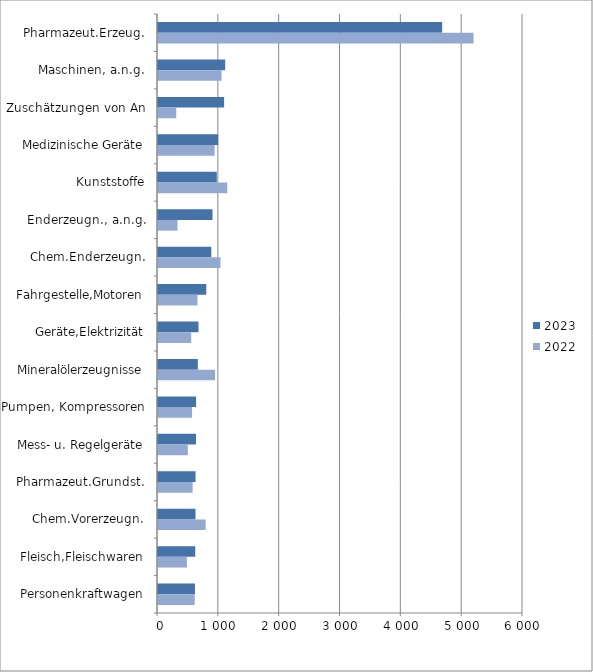
| Category | 2023 | 2022 |
|---|---|---|
| Pharmazeut.Erzeug. | 4671.345 | 5187.954 |
| Maschinen, a.n.g. | 1104.822 | 1044.624 |
| Zuschätzungen von An | 1086.782 | 299.87 |
| Medizinische Geräte | 989.804 | 931.34 |
| Kunststoffe | 966.875 | 1138.502 |
| Enderzeugn., a.n.g. | 895.772 | 320.14 |
| Chem.Enderzeugn. | 876.558 | 1026.548 |
| Fahrgestelle,Motoren | 793.657 | 648.655 |
| Geräte,Elektrizität | 666.262 | 545.796 |
| Mineralölerzeugnisse | 654.985 | 938.567 |
| Pumpen, Kompressoren | 626.367 | 559.863 |
| Mess- u. Regelgeräte | 624.542 | 489.874 |
| Pharmazeut.Grundst. | 617.748 | 568.977 |
| Chem.Vorerzeugn. | 616.216 | 783.078 |
| Fleisch,Fleischwaren | 612.531 | 474.817 |
| Personenkraftwagen | 607.54 | 603.037 |